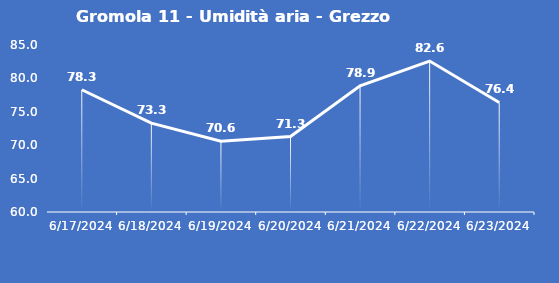
| Category | Gromola 11 - Umidità aria - Grezzo (%) |
|---|---|
| 6/17/24 | 78.3 |
| 6/18/24 | 73.3 |
| 6/19/24 | 70.6 |
| 6/20/24 | 71.3 |
| 6/21/24 | 78.9 |
| 6/22/24 | 82.6 |
| 6/23/24 | 76.4 |